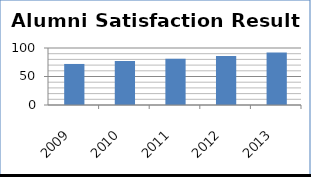
| Category | Alumni Satisfaction Results |
|---|---|
| 2009.0 | 72 |
| 2010.0 | 77 |
| 2011.0 | 81 |
| 2012.0 | 86 |
| 2013.0 | 92 |